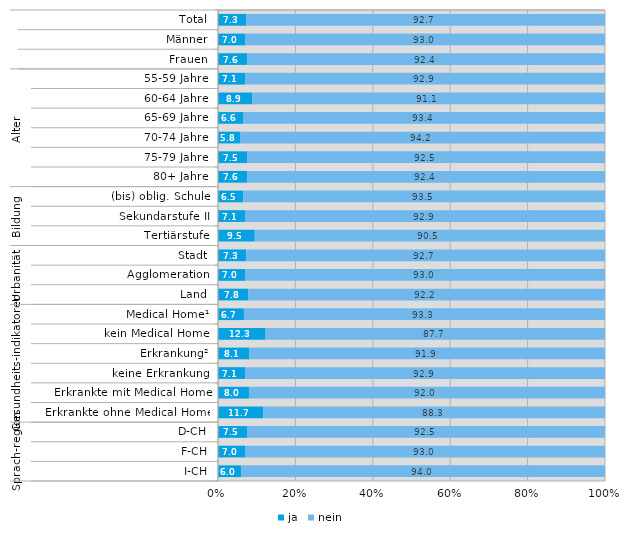
| Category | ja | nein |
|---|---|---|
| 0 | 7.3 | 92.7 |
| 1 | 7 | 93 |
| 2 | 7.6 | 92.4 |
| 3 | 7.1 | 92.9 |
| 4 | 8.9 | 91.1 |
| 5 | 6.6 | 93.4 |
| 6 | 5.8 | 94.2 |
| 7 | 7.5 | 92.5 |
| 8 | 7.6 | 92.4 |
| 9 | 6.5 | 93.5 |
| 10 | 7.1 | 92.9 |
| 11 | 9.5 | 90.5 |
| 12 | 7.3 | 92.7 |
| 13 | 7 | 93 |
| 14 | 7.8 | 92.2 |
| 15 | 6.7 | 93.3 |
| 16 | 12.3 | 87.7 |
| 17 | 8.1 | 91.9 |
| 18 | 7.1 | 92.9 |
| 19 | 8 | 92 |
| 20 | 11.7 | 88.3 |
| 21 | 7.5 | 92.5 |
| 22 | 7 | 93 |
| 23 | 6 | 94 |